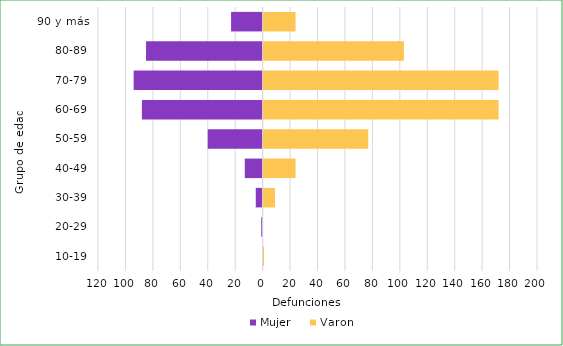
| Category | Mujer | Varon |
|---|---|---|
| 10-19 | 0 | 1 |
| 20-29 | -1 | 0 |
| 30-39 | -5 | 9 |
| 40-49 | -13 | 24 |
| 50-59 | -40 | 77 |
| 60-69 | -88 | 172 |
| 70-79 | -94 | 172 |
| 80-89 | -85 | 103 |
| 90 y más | -23 | 24 |